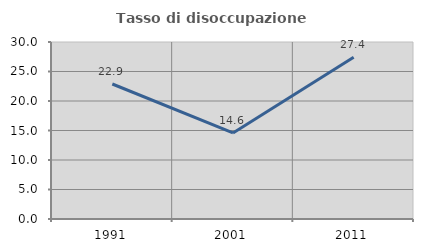
| Category | Tasso di disoccupazione giovanile  |
|---|---|
| 1991.0 | 22.879 |
| 2001.0 | 14.591 |
| 2011.0 | 27.404 |